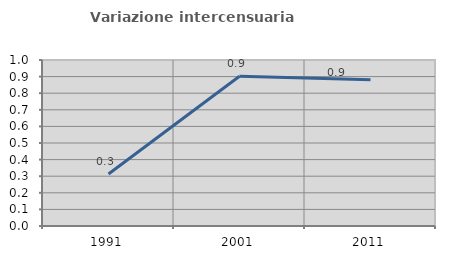
| Category | Variazione intercensuaria annua |
|---|---|
| 1991.0 | 0.313 |
| 2001.0 | 0.902 |
| 2011.0 | 0.881 |